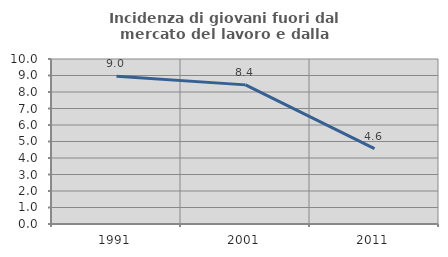
| Category | Incidenza di giovani fuori dal mercato del lavoro e dalla formazione  |
|---|---|
| 1991.0 | 8.95 |
| 2001.0 | 8.432 |
| 2011.0 | 4.571 |